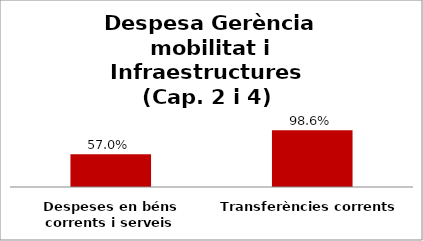
| Category | Series 0 |
|---|---|
| Despeses en béns corrents i serveis | 0.57 |
| Transferències corrents | 0.986 |